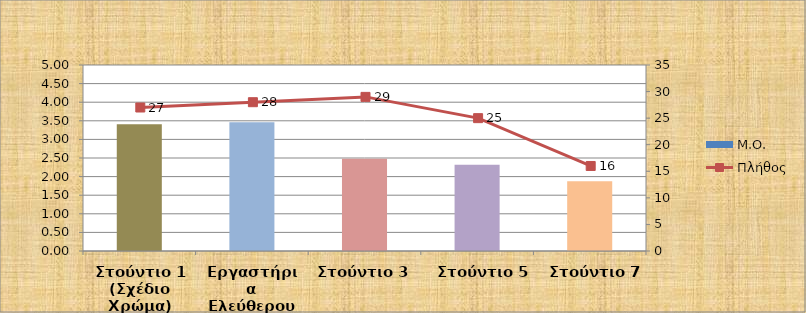
| Category | Μ.Ο. |
|---|---|
| Στούντιο 1 (Σχέδιο Χρώμα) | 3.407 |
| Εργαστήρια Ελεύθερου Σχεδίου 1 | 3.464 |
| Στούντιο 3  | 2.483 |
| Στούντιο 5 | 2.32 |
| Στούντιο 7 | 1.875 |